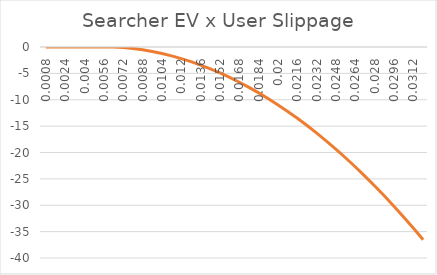
| Category | Searcher EV / User Volume  x User Slippage |
|---|---|
| 0.0008 | 0 |
| 0.0016 | 0 |
| 0.0024000000000000002 | 0 |
| 0.0032 | 0 |
| 0.004 | 0 |
| 0.0048000000000000004 | 0 |
| 0.005600000000000001 | 0 |
| 0.006400000000000001 | 0 |
| 0.0072000000000000015 | -0.078 |
| 0.008000000000000002 | -0.269 |
| 0.008800000000000002 | -0.526 |
| 0.009600000000000003 | -0.847 |
| 0.010400000000000003 | -1.234 |
| 0.011200000000000003 | -1.685 |
| 0.012000000000000004 | -2.202 |
| 0.012800000000000004 | -2.785 |
| 0.013600000000000004 | -3.432 |
| 0.014400000000000005 | -4.145 |
| 0.015200000000000005 | -4.924 |
| 0.016000000000000004 | -5.768 |
| 0.016800000000000002 | -6.678 |
| 0.0176 | -7.654 |
| 0.0184 | -8.696 |
| 0.0192 | -9.803 |
| 0.019999999999999997 | -10.976 |
| 0.020799999999999996 | -12.216 |
| 0.021599999999999994 | -13.521 |
| 0.022399999999999993 | -14.893 |
| 0.02319999999999999 | -16.33 |
| 0.02399999999999999 | -17.835 |
| 0.02479999999999999 | -19.405 |
| 0.025599999999999987 | -21.042 |
| 0.026399999999999986 | -22.745 |
| 0.027199999999999985 | -24.515 |
| 0.027999999999999983 | -26.352 |
| 0.028799999999999982 | -28.255 |
| 0.02959999999999998 | -30.225 |
| 0.03039999999999998 | -32.261 |
| 0.031199999999999978 | -34.365 |
| 0.03199999999999998 | -36.535 |